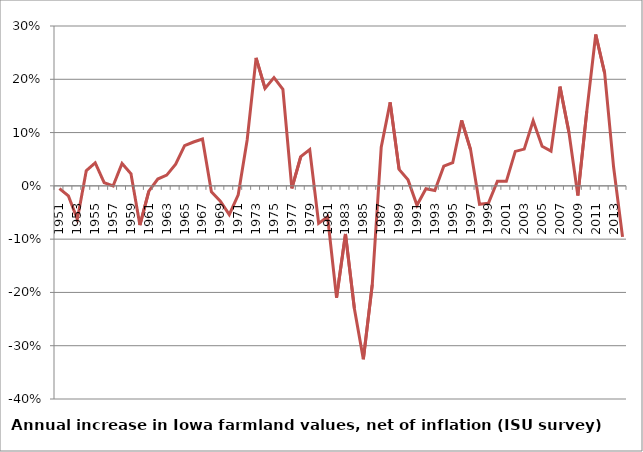
| Category | % |
|---|---|
| 1951.0 | -0.005 |
| 1952.0 | -0.019 |
| 1953.0 | -0.063 |
| 1954.0 | 0.028 |
| 1955.0 | 0.043 |
| 1956.0 | 0.006 |
| 1957.0 | 0 |
| 1958.0 | 0.042 |
| 1959.0 | 0.023 |
| 1960.0 | -0.074 |
| 1961.0 | -0.01 |
| 1962.0 | 0.013 |
| 1963.0 | 0.02 |
| 1964.0 | 0.041 |
| 1965.0 | 0.075 |
| 1966.0 | 0.082 |
| 1967.0 | 0.088 |
| 1968.0 | -0.011 |
| 1969.0 | -0.029 |
| 1970.0 | -0.054 |
| 1971.0 | -0.017 |
| 1972.0 | 0.086 |
| 1973.0 | 0.24 |
| 1974.0 | 0.183 |
| 1975.0 | 0.203 |
| 1976.0 | 0.181 |
| 1977.0 | -0.005 |
| 1978.0 | 0.055 |
| 1979.0 | 0.068 |
| 1980.0 | -0.07 |
| 1981.0 | -0.058 |
| 1982.0 | -0.21 |
| 1983.0 | -0.09 |
| 1984.0 | -0.231 |
| 1985.0 | -0.325 |
| 1986.0 | -0.185 |
| 1987.0 | 0.073 |
| 1988.0 | 0.157 |
| 1989.0 | 0.031 |
| 1990.0 | 0.011 |
| 1991.0 | -0.036 |
| 1992.0 | -0.005 |
| 1993.0 | -0.009 |
| 1994.0 | 0.037 |
| 1995.0 | 0.043 |
| 1996.0 | 0.123 |
| 1997.0 | 0.068 |
| 1998.0 | -0.035 |
| 1999.0 | -0.032 |
| 2000.0 | 0.009 |
| 2001.0 | 0.008 |
| 2002.0 | 0.065 |
| 2003.0 | 0.069 |
| 2004.0 | 0.122 |
| 2005.0 | 0.074 |
| 2006.0 | 0.065 |
| 2007.0 | 0.186 |
| 2008.0 | 0.101 |
| 2009.0 | -0.018 |
| 2010.0 | 0.14 |
| 2011.0 | 0.284 |
| 2012.0 | 0.211 |
| 2013.0 | 0.035 |
| 2014.0 | -0.096 |